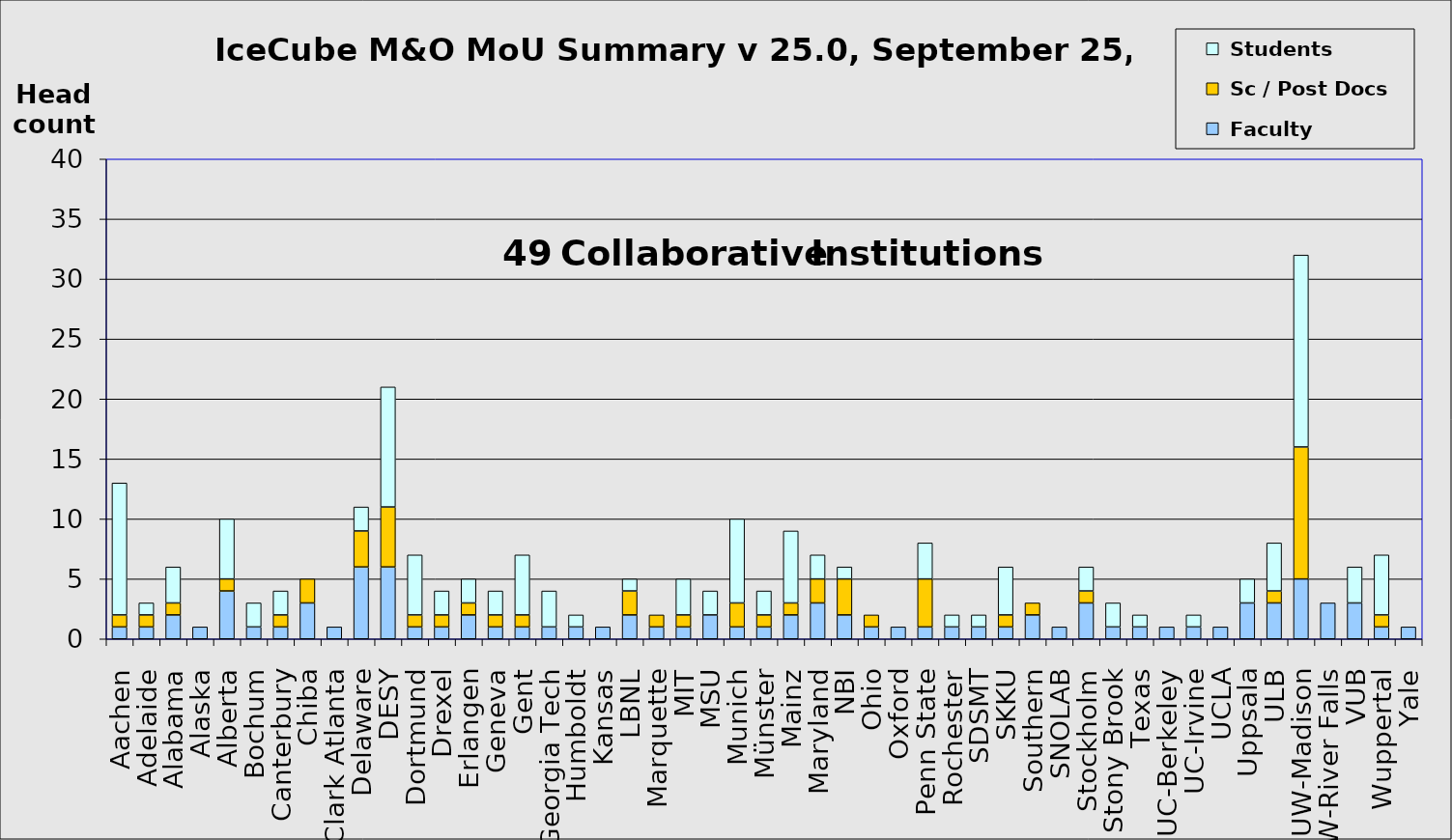
| Category |  Faculty |  Sc / Post Docs |  Students |
|---|---|---|---|
| Aachen | 1 | 1 | 11 |
| Adelaide | 1 | 1 | 1 |
| Alabama | 2 | 1 | 3 |
| Alaska | 1 | 0 | 0 |
| Alberta | 4 | 1 | 5 |
| Bochum | 1 | 0 | 2 |
| Canterbury | 1 | 1 | 2 |
| Chiba | 3 | 2 | 0 |
| Clark Atlanta | 1 | 0 | 0 |
| Delaware | 6 | 3 | 2 |
| DESY | 6 | 5 | 10 |
| Dortmund | 1 | 1 | 5 |
| Drexel | 1 | 1 | 2 |
| Erlangen | 2 | 1 | 2 |
| Geneva | 1 | 1 | 2 |
| Gent | 1 | 1 | 5 |
| Georgia Tech | 1 | 0 | 3 |
| Humboldt | 1 | 0 | 1 |
| Kansas | 1 | 0 | 0 |
| LBNL | 2 | 2 | 1 |
| Marquette | 1 | 1 | 0 |
| MIT | 1 | 1 | 3 |
| MSU | 2 | 0 | 2 |
| Munich | 1 | 2 | 7 |
| Münster | 1 | 1 | 2 |
| Mainz | 2 | 1 | 6 |
| Maryland | 3 | 2 | 2 |
| NBI | 2 | 3 | 1 |
| Ohio | 1 | 1 | 0 |
| Oxford | 1 | 0 | 0 |
| Penn State | 1 | 4 | 3 |
| Rochester | 1 | 0 | 1 |
| SDSMT | 1 | 0 | 1 |
| SKKU | 1 | 1 | 4 |
| Southern | 2 | 1 | 0 |
| SNOLAB | 1 | 0 | 0 |
| Stockholm | 3 | 1 | 2 |
| Stony Brook | 1 | 0 | 2 |
| Texas | 1 | 0 | 1 |
| UC-Berkeley | 1 | 0 | 0 |
| UC-Irvine | 1 | 0 | 1 |
| UCLA | 1 | 0 | 0 |
| Uppsala | 3 | 0 | 2 |
| ULB | 3 | 1 | 4 |
| UW-Madison | 5 | 11 | 16 |
| UW-River Falls | 3 | 0 | 0 |
| VUB | 3 | 0 | 3 |
| Wuppertal | 1 | 1 | 5 |
| Yale | 1 | 0 | 0 |